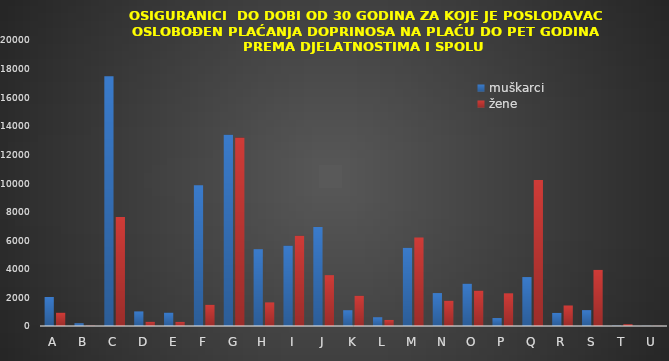
| Category | muškarci | žene |
|---|---|---|
| A | 2030 | 931 |
| B | 194 | 23 |
| C | 17461 | 7624 |
| D | 1020 | 294 |
| E | 936 | 288 |
| F | 9835 | 1483 |
| G | 13373 | 13178 |
| H | 5372 | 1650 |
| I | 5619 | 6306 |
| J | 6927 | 3555 |
| K | 1104 | 2114 |
| L | 613 | 423 |
| M | 5467 | 6194 |
| N | 2302 | 1769 |
| O | 2960 | 2475 |
| P | 556 | 2285 |
| Q | 3422 | 10203 |
| R | 915 | 1434 |
| S | 1110 | 3923 |
| T | 20 | 123 |
| U | 10 | 11 |